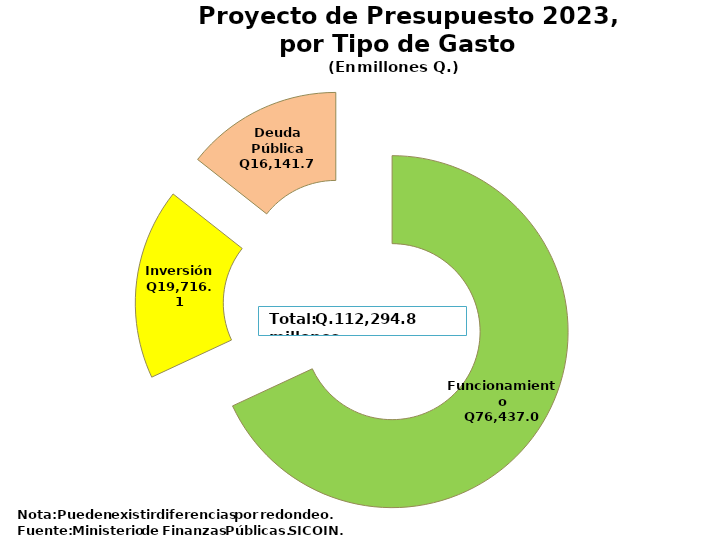
| Category | Recomendado 2022 |
|---|---|
| Funcionamiento | 76437 |
| Inversión | 19716.1 |
| Deuda Pública | 16141.7 |